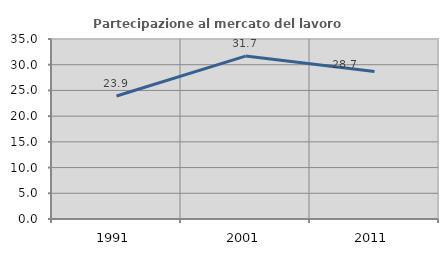
| Category | Partecipazione al mercato del lavoro  femminile |
|---|---|
| 1991.0 | 23.913 |
| 2001.0 | 31.678 |
| 2011.0 | 28.682 |